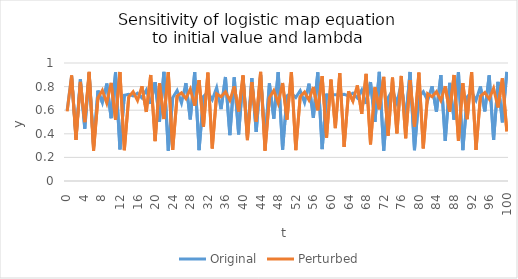
| Category | Original | Perturbed |
|---|---|---|
| 0.0 | 0.6 | 0.59 |
| 1.0 | 0.888 | 0.895 |
| 2.0 | 0.368 | 0.348 |
| 3.0 | 0.861 | 0.839 |
| 4.0 | 0.444 | 0.5 |
| 5.0 | 0.913 | 0.925 |
| 6.0 | 0.293 | 0.257 |
| 7.0 | 0.766 | 0.706 |
| 8.0 | 0.664 | 0.768 |
| 9.0 | 0.826 | 0.659 |
| 10.0 | 0.532 | 0.831 |
| 11.0 | 0.921 | 0.519 |
| 12.0 | 0.269 | 0.924 |
| 13.0 | 0.727 | 0.261 |
| 14.0 | 0.735 | 0.713 |
| 15.0 | 0.721 | 0.756 |
| 16.0 | 0.744 | 0.682 |
| 17.0 | 0.704 | 0.803 |
| 18.0 | 0.771 | 0.585 |
| 19.0 | 0.654 | 0.898 |
| 20.0 | 0.837 | 0.339 |
| 21.0 | 0.504 | 0.829 |
| 22.0 | 0.925 | 0.525 |
| 23.0 | 0.257 | 0.923 |
| 24.0 | 0.706 | 0.264 |
| 25.0 | 0.767 | 0.719 |
| 26.0 | 0.66 | 0.747 |
| 27.0 | 0.83 | 0.699 |
| 28.0 | 0.522 | 0.779 |
| 29.0 | 0.923 | 0.638 |
| 30.0 | 0.262 | 0.855 |
| 31.0 | 0.716 | 0.459 |
| 32.0 | 0.752 | 0.919 |
| 33.0 | 0.689 | 0.276 |
| 34.0 | 0.792 | 0.739 |
| 35.0 | 0.609 | 0.714 |
| 36.0 | 0.881 | 0.756 |
| 37.0 | 0.388 | 0.683 |
| 38.0 | 0.879 | 0.801 |
| 39.0 | 0.395 | 0.589 |
| 40.0 | 0.884 | 0.895 |
| 41.0 | 0.379 | 0.346 |
| 42.0 | 0.871 | 0.838 |
| 43.0 | 0.415 | 0.503 |
| 44.0 | 0.898 | 0.925 |
| 45.0 | 0.338 | 0.257 |
| 46.0 | 0.827 | 0.706 |
| 47.0 | 0.528 | 0.768 |
| 48.0 | 0.922 | 0.66 |
| 49.0 | 0.266 | 0.83 |
| 50.0 | 0.722 | 0.521 |
| 51.0 | 0.742 | 0.923 |
| 52.0 | 0.708 | 0.262 |
| 53.0 | 0.765 | 0.715 |
| 54.0 | 0.665 | 0.754 |
| 55.0 | 0.825 | 0.686 |
| 56.0 | 0.535 | 0.797 |
| 57.0 | 0.921 | 0.599 |
| 58.0 | 0.271 | 0.888 |
| 59.0 | 0.73 | 0.367 |
| 60.0 | 0.729 | 0.859 |
| 61.0 | 0.732 | 0.447 |
| 62.0 | 0.727 | 0.915 |
| 63.0 | 0.735 | 0.288 |
| 64.0 | 0.721 | 0.759 |
| 65.0 | 0.744 | 0.676 |
| 66.0 | 0.704 | 0.81 |
| 67.0 | 0.771 | 0.569 |
| 68.0 | 0.653 | 0.907 |
| 69.0 | 0.839 | 0.311 |
| 70.0 | 0.501 | 0.793 |
| 71.0 | 0.925 | 0.608 |
| 72.0 | 0.257 | 0.882 |
| 73.0 | 0.706 | 0.385 |
| 74.0 | 0.768 | 0.876 |
| 75.0 | 0.659 | 0.403 |
| 76.0 | 0.831 | 0.89 |
| 77.0 | 0.519 | 0.362 |
| 78.0 | 0.924 | 0.855 |
| 79.0 | 0.261 | 0.459 |
| 80.0 | 0.714 | 0.919 |
| 81.0 | 0.756 | 0.276 |
| 82.0 | 0.682 | 0.739 |
| 83.0 | 0.803 | 0.713 |
| 84.0 | 0.586 | 0.756 |
| 85.0 | 0.897 | 0.682 |
| 86.0 | 0.341 | 0.803 |
| 87.0 | 0.831 | 0.586 |
| 88.0 | 0.52 | 0.898 |
| 89.0 | 0.924 | 0.339 |
| 90.0 | 0.261 | 0.829 |
| 91.0 | 0.714 | 0.524 |
| 92.0 | 0.756 | 0.923 |
| 93.0 | 0.683 | 0.263 |
| 94.0 | 0.801 | 0.718 |
| 95.0 | 0.59 | 0.75 |
| 96.0 | 0.895 | 0.694 |
| 97.0 | 0.348 | 0.786 |
| 98.0 | 0.84 | 0.623 |
| 99.0 | 0.498 | 0.869 |
| 100.0 | 0.925 | 0.422 |